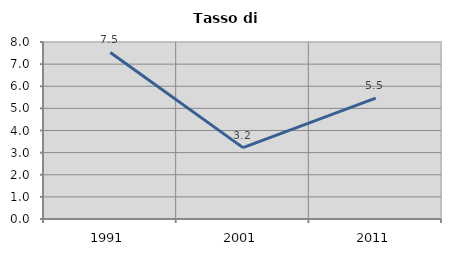
| Category | Tasso di disoccupazione   |
|---|---|
| 1991.0 | 7.526 |
| 2001.0 | 3.226 |
| 2011.0 | 5.467 |